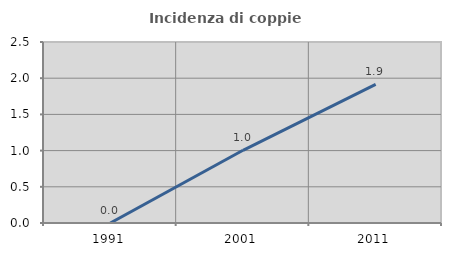
| Category | Incidenza di coppie miste |
|---|---|
| 1991.0 | 0 |
| 2001.0 | 1.004 |
| 2011.0 | 1.915 |